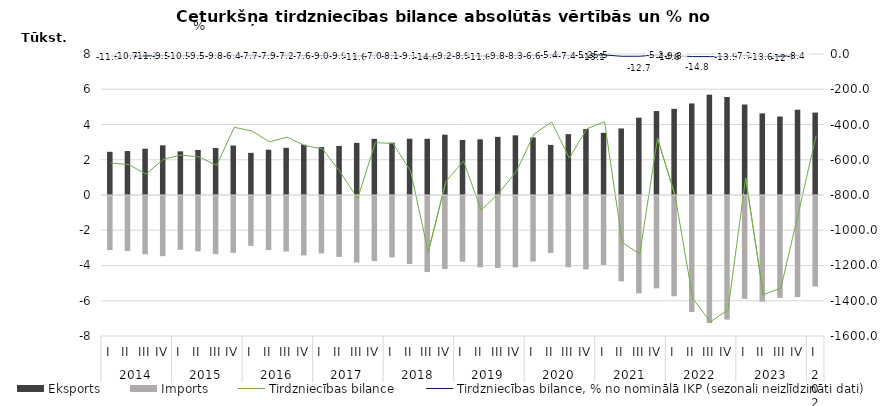
| Category | Eksports | Imports |
|---|---|---|
| 0 | 2450.7 | -3068.8 |
| 1 | 2493.4 | -3120.5 |
| 2 | 2625.5 | -3306.5 |
| 3 | 2816.7 | -3413.2 |
| 4 | 2476.5 | -3050.1 |
| 5 | 2555.2 | -3139.2 |
| 6 | 2663.4 | -3295.5 |
| 7 | 2809.5 | -3225.4 |
| 8 | 2391.5 | -2828.1 |
| 9 | 2569.5 | -3068 |
| 10 | 2678.2 | -3149.9 |
| 11 | 2850.8 | -3370.5 |
| 12 | 2719.6 | -3257.4 |
| 13 | 2783.8 | -3452 |
| 14 | 2956.9 | -3777.4 |
| 15 | 3187 | -3690 |
| 16 | 2969.9 | -3477.4 |
| 17 | 3193.3 | -3857.4 |
| 18 | 3189.7 | -4313.9 |
| 19 | 3420.5 | -4144.2 |
| 20 | 3123.6 | -3730.2 |
| 21 | 3158.2 | -4044.8 |
| 22 | 3298.5 | -4087.5 |
| 23 | 3385.3 | -4051.1 |
| 24 | 3266.4 | -3720.9 |
| 25 | 2842.7 | -3228.3 |
| 26 | 3452.8 | -4043.7 |
| 27 | 3742.7 | -4166.6 |
| 28 | 3526.2 | -3910.7 |
| 29 | 3776 | -4844.9 |
| 30 | 4388.7 | -5523.8 |
| 31 | 4761.5 | -5239.5 |
| 32 | 4886.7 | -5690.3 |
| 33 | 5194.3 | -6581.5 |
| 34 | 5692.8 | -7212.3 |
| 35 | 5559.7 | -7011.5 |
| 36 | 5134 | -5836.8 |
| 37 | 4631.3 | -5997.4 |
| 38 | 4454.2 | -5781.1 |
| 39 | 4840.3 | -5738.6 |
| 40 | 4676.7 | -5138.9 |